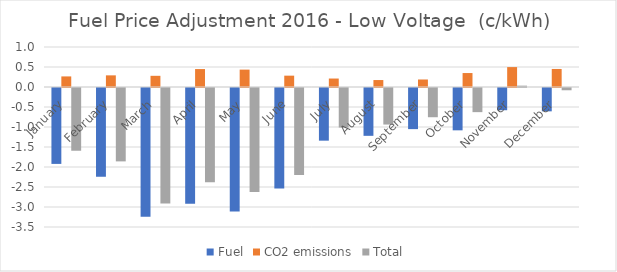
| Category | Fuel | CO2 emissions | Total |
|---|---|---|---|
| January | -1.898 | 0.265 | -1.569 |
| February | -2.216 | 0.291 | -1.835 |
| March | -3.221 | 0.28 | -2.885 |
| April | -2.897 | 0.449 | -2.359 |
| May | -3.09 | 0.435 | -2.597 |
| June | -2.515 | 0.284 | -2.175 |
| July | -1.317 | 0.212 | -0.989 |
| August | -1.196 | 0.174 | -0.914 |
| September | -1.028 | 0.188 | -0.731 |
| October | -1.058 | 0.349 | -0.604 |
| November | -0.556 | 0.498 | 0.034 |
| December | -0.583 | 0.451 | -0.057 |